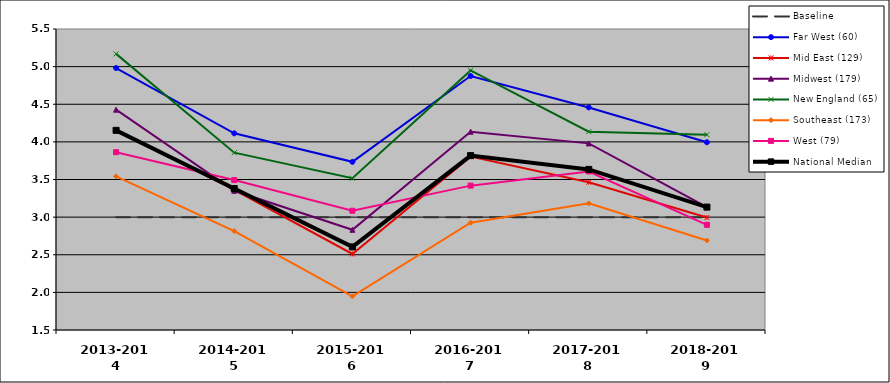
| Category | Baseline | Far West (60) | Mid East (129) | Midwest (179) | New England (65) | Southeast (173) | West (79) | National Median |
|---|---|---|---|---|---|---|---|---|
| 2013-2014 | 3 | 4.981 | 4.153 | 4.428 | 5.169 | 3.542 | 3.863 | 4.153 |
| 2014-2015 | 3 | 4.114 | 3.364 | 3.35 | 3.856 | 2.815 | 3.492 | 3.379 |
| 2015-2016 | 3 | 3.735 | 2.51 | 2.832 | 3.517 | 1.948 | 3.084 | 2.604 |
| 2016-2017 | 3 | 4.875 | 3.804 | 4.135 | 4.949 | 2.926 | 3.418 | 3.818 |
| 2017-2018 | 3 | 4.458 | 3.464 | 3.98 | 4.136 | 3.183 | 3.606 | 3.634 |
| 2018-2019 | 3 | 3.995 | 2.995 | 3.133 | 4.095 | 2.69 | 2.898 | 3.133 |